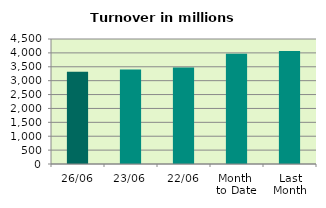
| Category | Series 0 |
|---|---|
| 26/06 | 3316.531 |
| 23/06 | 3405.424 |
| 22/06 | 3477.511 |
| Month 
to Date | 3968.335 |
| Last
Month | 4067.502 |